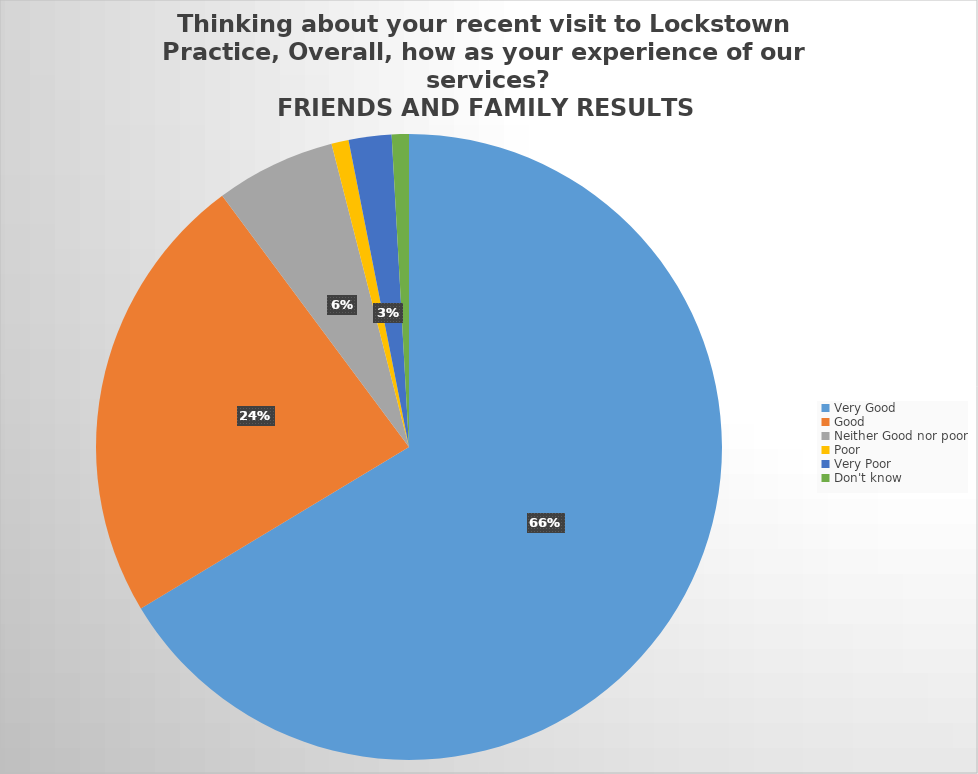
| Category | Responses |
|---|---|
| Very Good | 150 |
| Good | 53 |
| Neither Good nor poor | 14 |
| Poor | 2 |
| Very Poor | 5 |
| Don't know  | 2 |